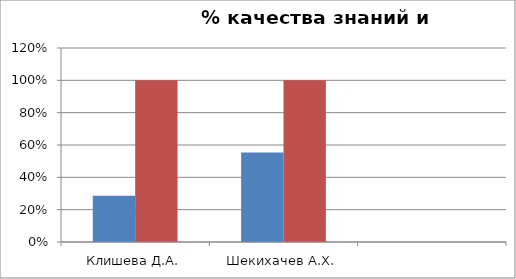
| Category | Series 0 | 2 |
|---|---|---|
| Клишева Д.А. | 0.286 | 1 |
| Шекихачев А.Х. | 0.553 | 1 |